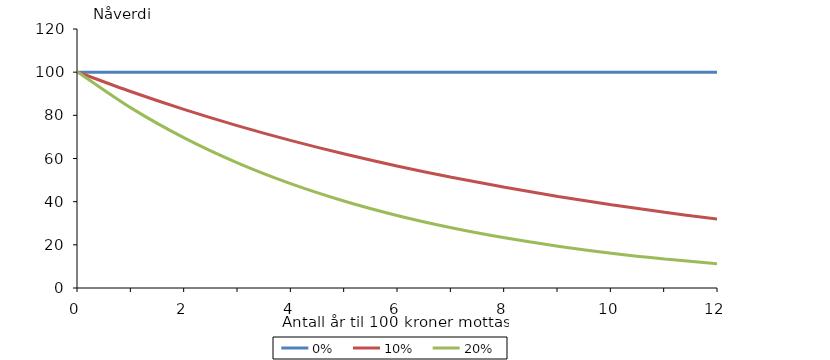
| Category | 0 % | 10 % | 20 % |
|---|---|---|---|
| 0.0 | 100 | 100 | 100 |
| 1.0 | 100 | 90.909 | 83.333 |
| 2.0 | 100 | 82.645 | 69.444 |
| 3.0 | 100 | 75.131 | 57.87 |
| 4.0 | 100 | 68.301 | 48.225 |
| 5.0 | 100 | 62.092 | 40.188 |
| 6.0 | 100 | 56.447 | 33.49 |
| 7.0 | 100 | 51.316 | 27.908 |
| 8.0 | 100 | 46.651 | 23.257 |
| 9.0 | 100 | 42.41 | 19.381 |
| 10.0 | 100 | 38.554 | 16.151 |
| 11.0 | 100 | 35.049 | 13.459 |
| 12.0 | 100 | 31.863 | 11.216 |